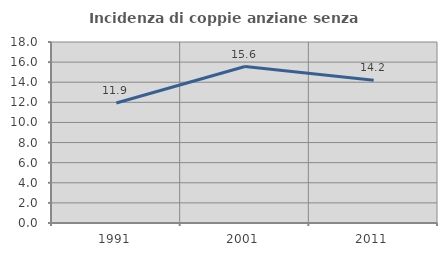
| Category | Incidenza di coppie anziane senza figli  |
|---|---|
| 1991.0 | 11.933 |
| 2001.0 | 15.562 |
| 2011.0 | 14.198 |